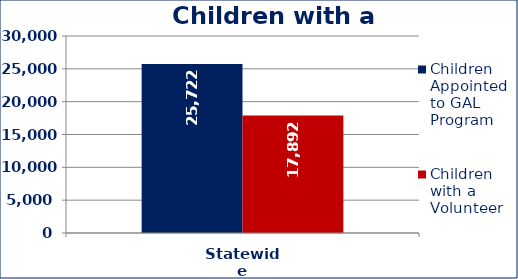
| Category | Children Appointed to GAL Program  | Children with a Volunteer  |
|---|---|---|
| Statewide | 25722 | 17892 |